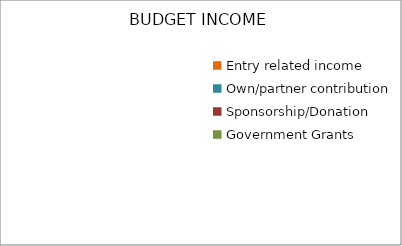
| Category | Series 0 |
|---|---|
| Entry related income | 0 |
| Own/partner contribution | 0 |
| Sponsorship/Donation | 0 |
| Government Grants | 0 |